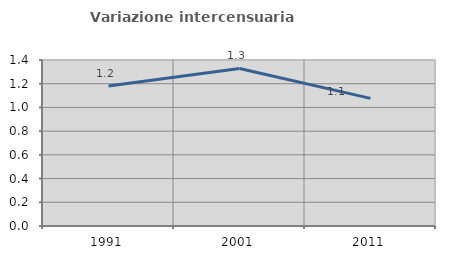
| Category | Variazione intercensuaria annua |
|---|---|
| 1991.0 | 1.18 |
| 2001.0 | 1.329 |
| 2011.0 | 1.076 |